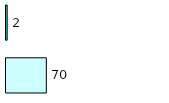
| Category | Series 0 | Series 1 |
|---|---|---|
| 0 | 70 | 2 |